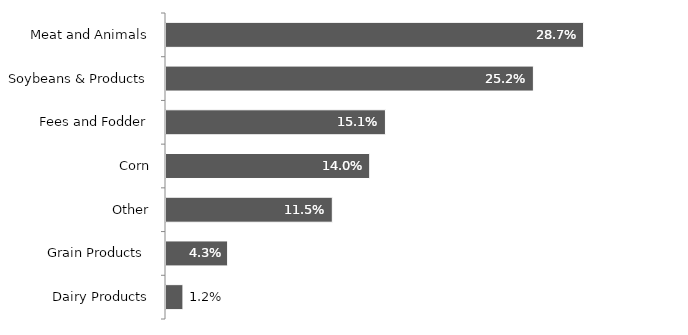
| Category | Series 0 |
|---|---|
| Dairy Products | 0.012 |
| Grain Products  | 0.043 |
| Other | 0.115 |
| Corn | 0.14 |
| Fees and Fodder | 0.151 |
| Soybeans & Products | 0.252 |
| Meat and Animals | 0.287 |